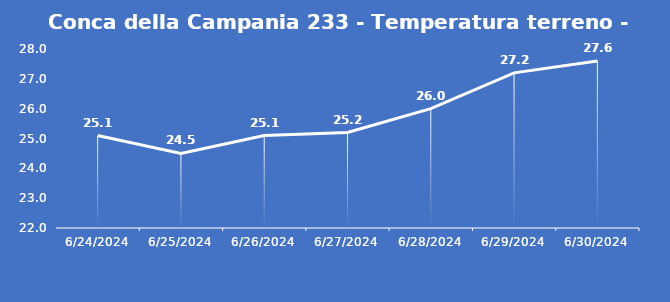
| Category | Conca della Campania 233 - Temperatura terreno - Grezzo (°C) |
|---|---|
| 6/24/24 | 25.1 |
| 6/25/24 | 24.5 |
| 6/26/24 | 25.1 |
| 6/27/24 | 25.2 |
| 6/28/24 | 26 |
| 6/29/24 | 27.2 |
| 6/30/24 | 27.6 |